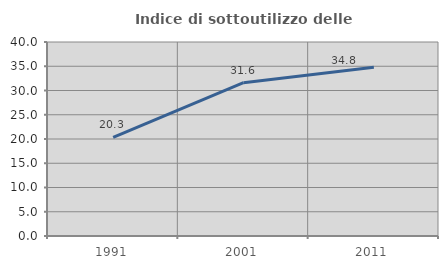
| Category | Indice di sottoutilizzo delle abitazioni  |
|---|---|
| 1991.0 | 20.346 |
| 2001.0 | 31.621 |
| 2011.0 | 34.8 |